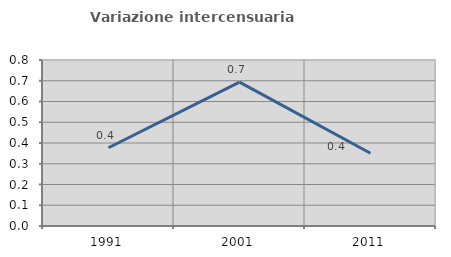
| Category | Variazione intercensuaria annua |
|---|---|
| 1991.0 | 0.377 |
| 2001.0 | 0.693 |
| 2011.0 | 0.35 |